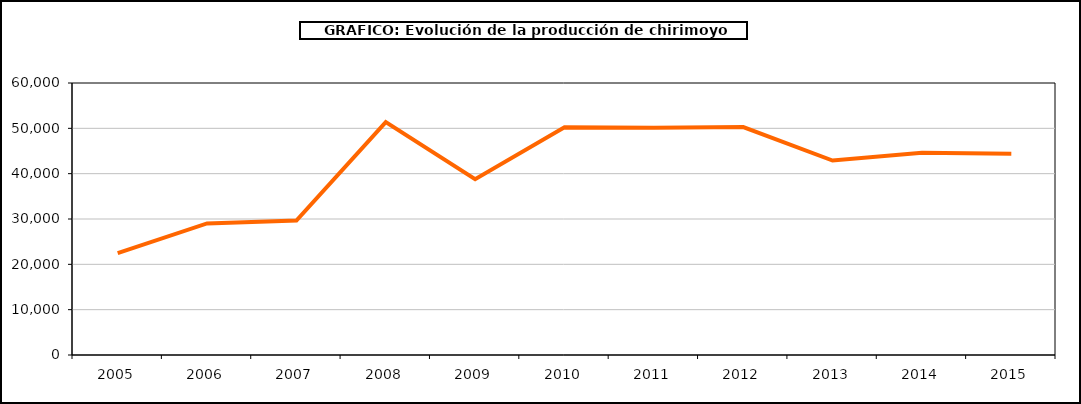
| Category | producción chirimoyo |
|---|---|
| 2005.0 | 22451 |
| 2006.0 | 29025 |
| 2007.0 | 29671 |
| 2008.0 | 51356 |
| 2009.0 | 38775 |
| 2010.0 | 50241 |
| 2011.0 | 50150 |
| 2012.0 | 50285 |
| 2013.0 | 42898 |
| 2014.0 | 44629 |
| 2015.0 | 44389 |